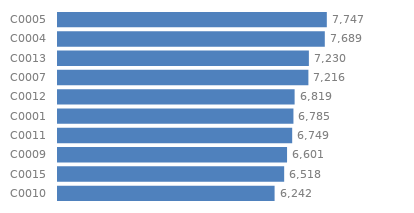
| Category | Total |
|---|---|
| C0005 | 7747 |
| C0004 | 7689 |
| C0013 | 7230 |
| C0007 | 7216 |
| C0012 | 6819 |
| C0001 | 6785 |
| C0011 | 6749 |
| C0009 | 6601 |
| C0015 | 6518 |
| C0010 | 6242 |